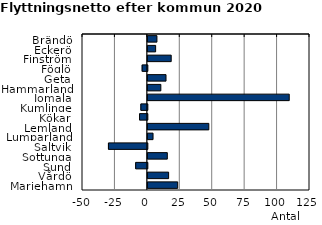
| Category | Series 0 |
|---|---|
| Brändö | 7 |
| Eckerö | 6 |
| Finström | 18 |
| Föglö | -4 |
| Geta | 14 |
| Hammarland | 10 |
| Jomala | 109 |
| Kumlinge | -5 |
| Kökar | -6 |
| Lemland | 47 |
| Lumparland | 4 |
| Saltvik | -30 |
| Sottunga | 15 |
| Sund | -9 |
| Vårdö | 16 |
| Mariehamn | 23 |